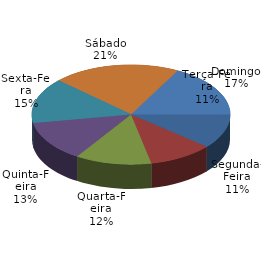
| Category | Qtde Acidentes |
|---|---|
| Segunda-Feira | 170 |
| Terça-Feira | 160 |
| Quarta-Feira | 188 |
| Quinta-Feira | 200 |
| Sexta-Feira | 223 |
| Sábado | 317 |
| Domingo | 261 |